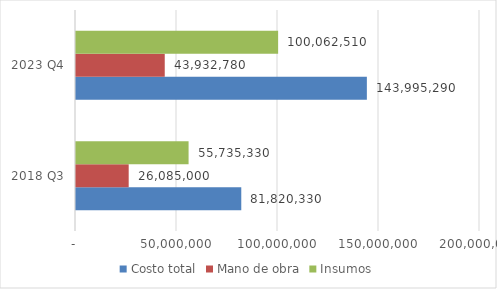
| Category | Costo total | Mano de obra | Insumos |
|---|---|---|---|
| 2018 Q3 | 81820330 | 26085000 | 55735330 |
| 2023 Q4 | 143995290.108 | 43932780 | 100062510.108 |